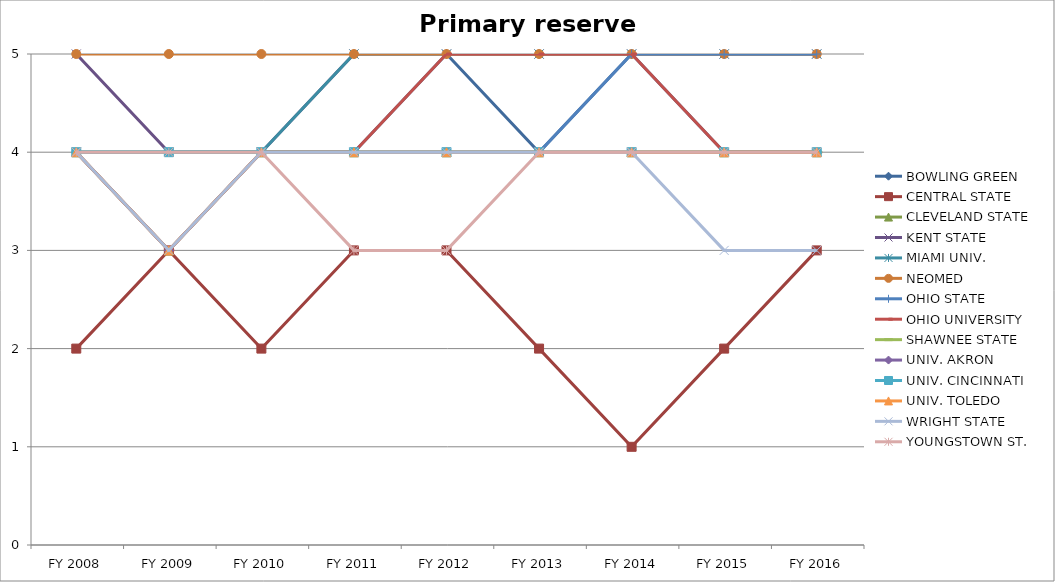
| Category | BOWLING GREEN  | CENTRAL STATE  | CLEVELAND STATE  | KENT STATE  | MIAMI UNIV.  | NEOMED  | OHIO STATE  | OHIO UNIVERSITY  | SHAWNEE STATE  | UNIV. AKRON  | UNIV. CINCINNATI  | UNIV. TOLEDO  | WRIGHT STATE  | YOUNGSTOWN ST.  |
|---|---|---|---|---|---|---|---|---|---|---|---|---|---|---|
| FY 2016 | 4 | 3 | 4 | 5 | 5 | 5 | 5 | 4 | 4 | 4 | 4 | 4 | 3 | 4 |
| FY 2015 | 4 | 2 | 4 | 5 | 5 | 5 | 5 | 4 | 4 | 4 | 4 | 4 | 3 | 4 |
| FY 2014 | 5 | 1 | 4 | 5 | 5 | 5 | 5 | 5 | 4 | 4 | 4 | 4 | 4 | 4 |
| FY 2013 | 4 | 2 | 4 | 5 | 5 | 5 | 4 | 5 | 4 | 4 | 4 | 4 | 4 | 4 |
| FY 2012 | 5 | 3 | 4 | 5 | 5 | 5 | 4 | 5 | 4 | 4 | 4 | 4 | 4 | 3 |
| FY 2011 | 4 | 3 | 4 | 5 | 5 | 5 | 4 | 4 | 4 | 4 | 4 | 4 | 4 | 3 |
| FY 2010 | 4 | 2 | 4 | 4 | 4 | 5 | 4 | 4 | 4 | 4 | 4 | 4 | 4 | 4 |
| FY 2009 | 4 | 3 | 3 | 4 | 4 | 5 | 4 | 3 | 4 | 3 | 4 | 3 | 3 | 4 |
| FY 2008 | 4 | 2 | 4 | 5 | 4 | 5 | 4 | 4 | 4 | 4 | 4 | 4 | 4 | 4 |